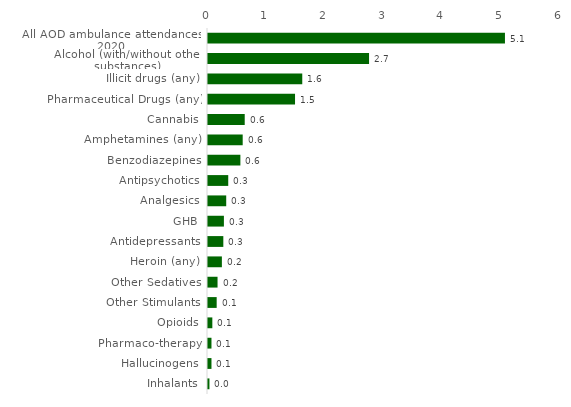
| Category | Series 0 |
|---|---|
| All AOD ambulance attendances: 2020 | 5.062 |
| Alcohol (with/without other substances) | 2.745 |
| Illicit drugs (any) | 1.607 |
| Pharmaceutical Drugs (any) | 1.484 |
| Cannabis | 0.626 |
| Amphetamines (any) | 0.591 |
| Benzodiazepines | 0.552 |
| Antipsychotics | 0.345 |
| Analgesics | 0.311 |
| GHB | 0.271 |
| Antidepressants | 0.261 |
| Heroin (any) | 0.237 |
| Other Sedatives | 0.163 |
| Other Stimulants | 0.148 |
| Opioids | 0.074 |
| Pharmaco-therapy | 0.059 |
| Hallucinogens | 0.059 |
| Inhalants | 0.025 |